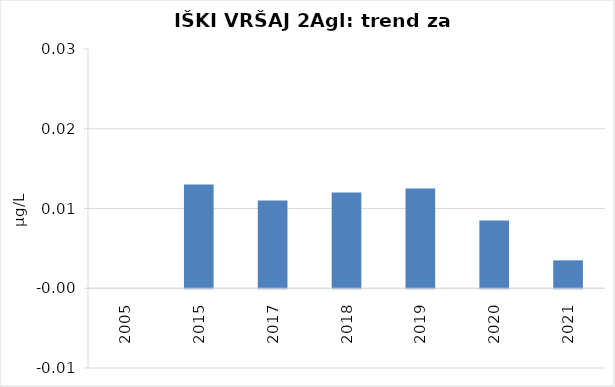
| Category | Vsota |
|---|---|
| 2005 | 0 |
| 2015 | 0.013 |
| 2017 | 0.011 |
| 2018 | 0.012 |
| 2019 | 0.012 |
| 2020 | 0.008 |
| 2021 | 0.004 |